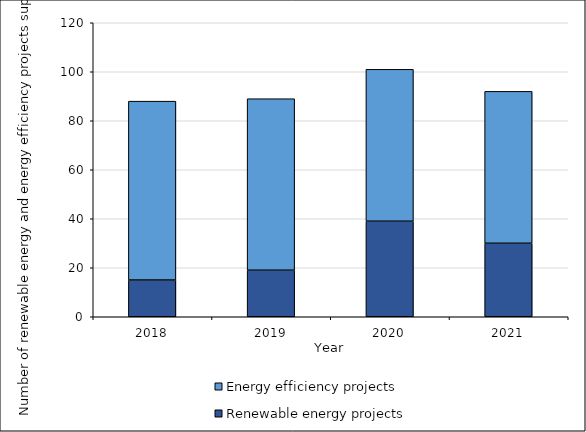
| Category | Renewable energy projects | Energy efficiency projects |
|---|---|---|
| 2018.0 | 15 | 73 |
| 2019.0 | 19 | 70 |
| 2020.0 | 39 | 62 |
| 2021.0 | 30 | 62 |